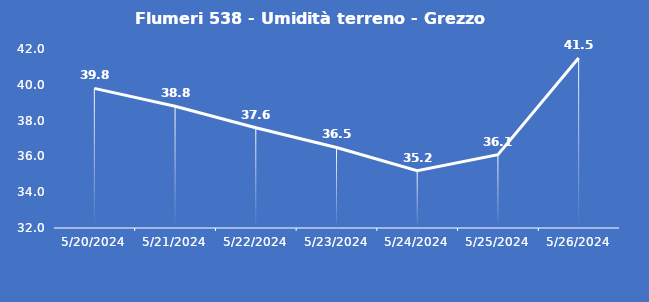
| Category | Flumeri 538 - Umidità terreno - Grezzo (%VWC) |
|---|---|
| 5/20/24 | 39.8 |
| 5/21/24 | 38.8 |
| 5/22/24 | 37.6 |
| 5/23/24 | 36.5 |
| 5/24/24 | 35.2 |
| 5/25/24 | 36.1 |
| 5/26/24 | 41.5 |